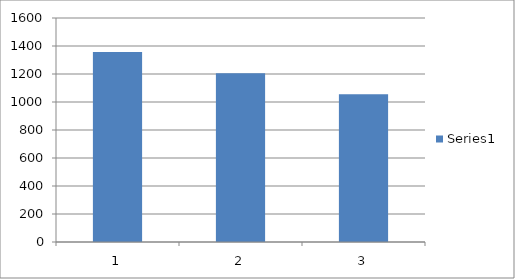
| Category | Series 0 |
|---|---|
| 0 | 1356.546 |
| 1 | 1206 |
| 2 | 1055.454 |